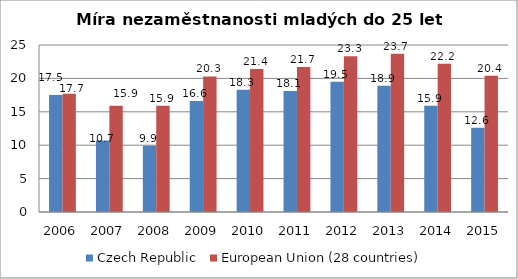
| Category | Czech Republic | European Union (28 countries) |
|---|---|---|
| 2006 | 17.5 | 17.7 |
| 2007 | 10.7 | 15.9 |
| 2008 | 9.9 | 15.9 |
| 2009 | 16.6 | 20.3 |
| 2010 | 18.3 | 21.4 |
| 2011 | 18.1 | 21.7 |
| 2012 | 19.5 | 23.3 |
| 2013 | 18.9 | 23.7 |
| 2014 | 15.9 | 22.2 |
| 2015 | 12.6 | 20.4 |